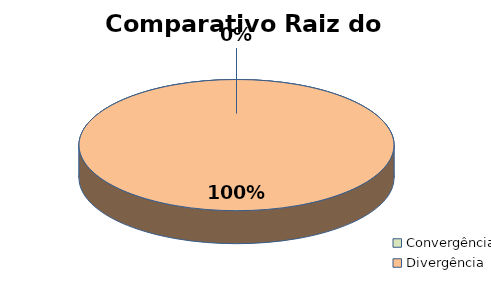
| Category | Series 0 |
|---|---|
| Convergência | 0 |
| Divergência | 26 |